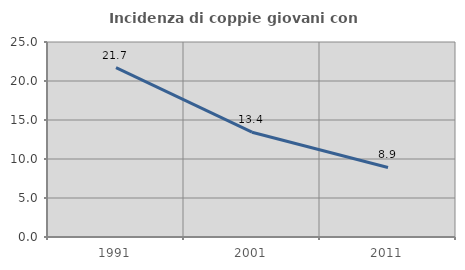
| Category | Incidenza di coppie giovani con figli |
|---|---|
| 1991.0 | 21.728 |
| 2001.0 | 13.433 |
| 2011.0 | 8.911 |